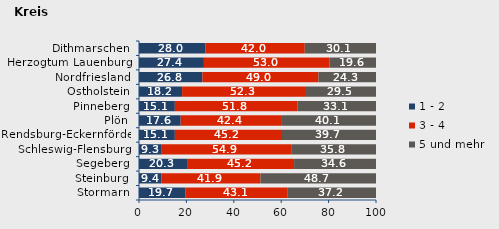
| Category | 1 - 2 | 3 - 4 | 5 und mehr |
|---|---|---|---|
| Stormarn | 19.67 | 43.11 | 37.22 |
| Steinburg | 9.402 | 41.88 | 48.718 |
| Segeberg | 20.275 | 45.165 | 34.56 |
| Schleswig-Flensburg | 9.321 | 54.884 | 35.794 |
| Rendsburg-Eckernförde | 15.128 | 45.214 | 39.658 |
| Plön | 17.579 | 42.363 | 40.058 |
| Pinneberg | 15.124 | 51.819 | 33.057 |
| Ostholstein | 18.182 | 52.293 | 29.525 |
| Nordfriesland | 26.752 | 48.989 | 24.259 |
| Herzogtum Lauenburg | 27.403 | 52.965 | 19.632 |
| Dithmarschen | 27.976 | 41.964 | 30.06 |